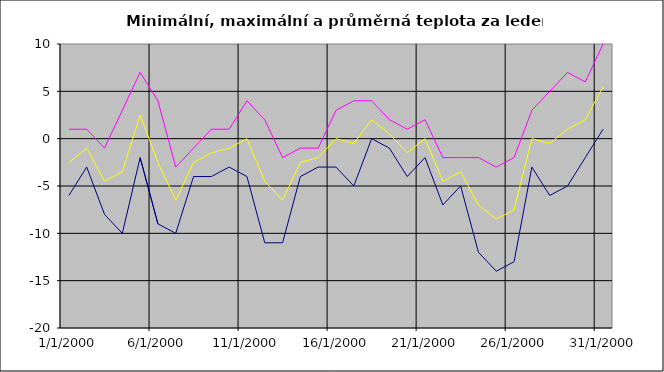
| Category | Series 0 | Series 1 | Series 2 |
|---|---|---|---|
| 2000-01-01 | -6 | 1 | -2.5 |
| 2000-01-02 | -3 | 1 | -1 |
| 2000-01-03 | -8 | -1 | -4.5 |
| 2000-01-04 | -10 | 3 | -3.5 |
| 2000-01-05 | -2 | 7 | 2.5 |
| 2000-01-06 | -9 | 4 | -2.5 |
| 2000-01-07 | -10 | -3 | -6.5 |
| 2000-01-08 | -4 | -1 | -2.5 |
| 2000-01-09 | -4 | 1 | -1.5 |
| 2000-01-10 | -3 | 1 | -1 |
| 2000-01-11 | -4 | 4 | 0 |
| 2000-01-12 | -11 | 2 | -4.5 |
| 2000-01-13 | -11 | -2 | -6.5 |
| 2000-01-14 | -4 | -1 | -2.5 |
| 2000-01-15 | -3 | -1 | -2 |
| 2000-01-16 | -3 | 3 | 0 |
| 2000-01-17 | -5 | 4 | -0.5 |
| 2000-01-18 | 0 | 4 | 2 |
| 2000-01-19 | -1 | 2 | 0.5 |
| 2000-01-20 | -4 | 1 | -1.5 |
| 2000-01-21 | -2 | 2 | 0 |
| 2000-01-22 | -7 | -2 | -4.5 |
| 2000-01-23 | -5 | -2 | -3.5 |
| 2000-01-24 | -12 | -2 | -7 |
| 2000-01-25 | -14 | -3 | -8.5 |
| 2000-01-26 | -13 | -2 | -7.5 |
| 2000-01-27 | -3 | 3 | 0 |
| 2000-01-28 | -6 | 5 | -0.5 |
| 2000-01-29 | -5 | 7 | 1 |
| 2000-01-30 | -2 | 6 | 2 |
| 2000-01-31 | 1 | 10 | 5.5 |